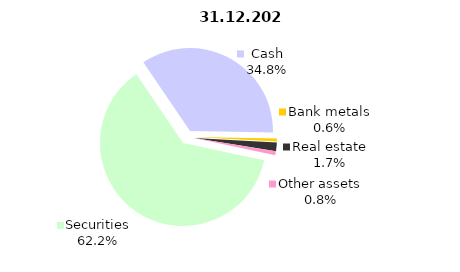
| Category | Total |
|---|---|
| Securities | 1196.182 |
| Cash | 669.471 |
| Bank metals | 11.009 |
| Real estate | 32.274 |
| Other assets | 15.233 |